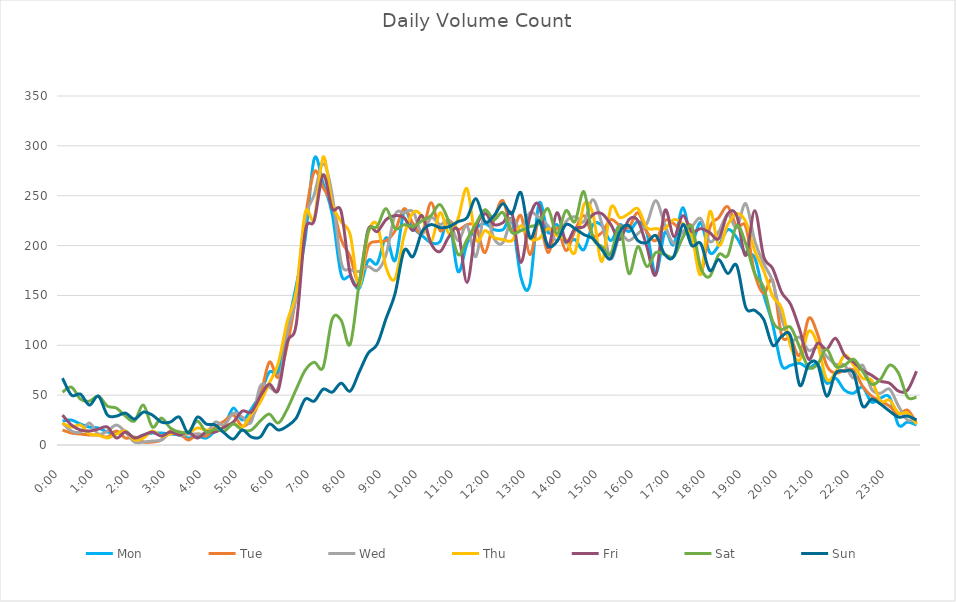
| Category | Mon | Tue | Wed | Thu | Fri | Sat | Sun |
|---|---|---|---|---|---|---|---|
| 0.0 | 24 | 15 | 22 | 22 | 30 | 53 | 67 |
| 0.010416666666666666 | 25 | 12 | 14 | 18 | 20 | 58 | 50 |
| 0.020833333333333332 | 21 | 11 | 13 | 20 | 15 | 46 | 51 |
| 0.03125 | 18 | 10 | 22 | 11 | 14 | 44 | 40 |
| 0.041666666666666664 | 17 | 10 | 11 | 10 | 16 | 49 | 49 |
| 0.05208333333333333 | 13 | 8 | 14 | 7 | 18 | 39 | 30 |
| 0.06249999999999999 | 12 | 14 | 20 | 11 | 7 | 37 | 29 |
| 0.07291666666666666 | 14 | 7 | 13 | 14 | 13 | 29 | 32 |
| 0.08333333333333333 | 7 | 8 | 3 | 5 | 7 | 24 | 26 |
| 0.09375 | 10 | 3 | 3 | 7 | 10 | 40 | 33 |
| 0.10416666666666667 | 12 | 3 | 4 | 14 | 13 | 18 | 30 |
| 0.11458333333333334 | 12 | 5 | 5 | 9 | 9 | 27 | 23 |
| 0.125 | 11 | 14 | 12 | 11 | 13 | 17 | 23 |
| 0.13541666666666666 | 10 | 12 | 10 | 13 | 10 | 13 | 28 |
| 0.14583333333333331 | 7 | 5 | 11 | 12 | 13 | 13 | 12 |
| 0.15624999999999997 | 9 | 11 | 11 | 17 | 7 | 24 | 28 |
| 0.16666666666666663 | 7 | 9 | 12 | 15 | 13 | 13 | 21 |
| 0.1770833333333333 | 14 | 18 | 23 | 15 | 13 | 16 | 20 |
| 0.18749999999999994 | 19 | 24 | 20 | 18 | 18 | 14 | 12 |
| 0.1979166666666666 | 37 | 30 | 32 | 22 | 23 | 21 | 6 |
| 0.20833333333333326 | 25 | 19 | 28 | 18 | 34 | 15 | 15 |
| 0.21874999999999992 | 36 | 26 | 23 | 31 | 33 | 15 | 8 |
| 0.22916666666666657 | 51 | 48 | 59 | 43 | 49 | 24 | 8 |
| 0.23958333333333323 | 73 | 83 | 58 | 62 | 61 | 31 | 21 |
| 0.2499999999999999 | 74 | 68 | 58 | 82 | 55 | 22 | 15 |
| 0.2604166666666666 | 117 | 100 | 113 | 124 | 103 | 36 | 19 |
| 0.27083333333333326 | 160 | 152 | 148 | 154 | 121 | 56 | 27 |
| 0.28124999999999994 | 207 | 227 | 226 | 233 | 214 | 75 | 46 |
| 0.29166666666666663 | 287 | 274 | 251 | 227 | 225 | 83 | 44 |
| 0.3020833333333333 | 262 | 258 | 282 | 289 | 271 | 78 | 56 |
| 0.3125 | 232 | 241 | 251 | 242 | 237 | 126 | 53 |
| 0.3229166666666667 | 171 | 206 | 183 | 224 | 234 | 125 | 62 |
| 0.33333333333333337 | 169 | 189 | 176 | 211 | 172 | 101 | 54 |
| 0.34375000000000006 | 157 | 163 | 174 | 159 | 163 | 162 | 73 |
| 0.35416666666666674 | 185 | 199 | 179 | 212 | 216 | 214 | 92 |
| 0.3645833333333334 | 182 | 204 | 175 | 221 | 214 | 219 | 101 |
| 0.3750000000000001 | 208 | 205 | 191 | 178 | 226 | 237 | 127 |
| 0.3854166666666668 | 185 | 215 | 231 | 167 | 230 | 217 | 152 |
| 0.3958333333333335 | 234 | 237 | 233 | 210 | 228 | 221 | 195 |
| 0.40625000000000017 | 218 | 222 | 234 | 233 | 215 | 219 | 189 |
| 0.41666666666666685 | 210 | 213 | 212 | 229 | 230 | 225 | 214 |
| 0.4270833333333333 | 203 | 243 | 228 | 204 | 202 | 230 | 221 |
| 0.4375000000000002 | 204 | 215 | 221 | 233 | 194 | 241 | 218 |
| 0.4479166666666669 | 225 | 225 | 225 | 212 | 209 | 223 | 219 |
| 0.4583333333333333 | 174 | 216 | 205 | 227 | 215 | 191 | 224 |
| 0.4687500000000003 | 202 | 221 | 220 | 257 | 163 | 206 | 228 |
| 0.47916666666666696 | 217 | 219 | 189 | 206 | 217 | 222 | 247 |
| 0.4895833333333333 | 222 | 193 | 235 | 215 | 232 | 236 | 224 |
| 0.5000000000000003 | 216 | 226 | 207 | 208 | 221 | 226 | 230 |
| 0.510416666666667 | 216 | 245 | 203 | 206 | 223 | 233 | 242 |
| 0.5208333333333334 | 225 | 214 | 227 | 205 | 232 | 213 | 232 |
| 0.5312500000000002 | 168 | 230 | 215 | 220 | 183 | 215 | 253 |
| 0.5416666666666669 | 161 | 191 | 233 | 207 | 229 | 219 | 208 |
| 0.5520833333333335 | 242 | 224 | 228 | 207 | 241 | 222 | 225 |
| 0.5625000000000001 | 213 | 193 | 220 | 217 | 198 | 237 | 200 |
| 0.5729166666666667 | 221 | 218 | 205 | 210 | 233 | 212 | 204 |
| 0.5833333333333334 | 203 | 195 | 224 | 206 | 204 | 235 | 221 |
| 0.59375 | 206 | 215 | 229 | 193 | 217 | 224 | 217 |
| 0.6041666666666666 | 196 | 230 | 224 | 241 | 219 | 254 | 211 |
| 0.6145833333333333 | 221 | 210 | 246 | 232 | 231 | 208 | 207 |
| 0.6249999999999999 | 220 | 213 | 222 | 184 | 232 | 199 | 196 |
| 0.6354166666666665 | 205 | 226 | 187 | 238 | 221 | 192 | 187 |
| 0.6458333333333331 | 221 | 220 | 210 | 228 | 206 | 219 | 214 |
| 0.6562499999999998 | 214 | 218 | 205 | 232 | 226 | 172 | 220 |
| 0.6666666666666666 | 224 | 233 | 212 | 237 | 225 | 199 | 205 |
| 0.677083333333333 | 213 | 214 | 222 | 218 | 199 | 179 | 203 |
| 0.6874999999999997 | 172 | 205 | 245 | 217 | 171 | 193 | 210 |
| 0.6979166666666666 | 213 | 225 | 221 | 217 | 235 | 191 | 191 |
| 0.7083333333333329 | 201 | 222 | 202 | 226 | 209 | 189 | 189 |
| 0.7187499999999996 | 238 | 214 | 214 | 222 | 230 | 208 | 221 |
| 0.7291666666666666 | 205 | 219 | 219 | 210 | 214 | 219 | 200 |
| 0.7395833333333328 | 223 | 173 | 227 | 171 | 217 | 178 | 202 |
| 0.75 | 193 | 218 | 204 | 234 | 213 | 169 | 175 |
| 0.7604166666666666 | 200 | 228 | 214 | 200 | 207 | 191 | 186 |
| 0.7708333333333327 | 216 | 239 | 231 | 221 | 232 | 190 | 172 |
| 0.78125 | 208 | 219 | 218 | 232 | 230 | 220 | 180 |
| 0.7916666666666666 | 192 | 219 | 242 | 224 | 190 | 202 | 138 |
| 0.8020833333333326 | 188 | 172 | 205 | 195 | 235 | 172 | 135 |
| 0.8125 | 151 | 152 | 182 | 175 | 189 | 158 | 126 |
| 0.8229166666666666 | 121 | 165 | 164 | 149 | 177 | 124 | 100 |
| 0.8333333333333334 | 80 | 110 | 127 | 137 | 153 | 116 | 109 |
| 0.84375 | 80 | 107 | 105 | 99 | 141 | 118 | 109 |
| 0.8541666666666666 | 82 | 90 | 108 | 85 | 116 | 98 | 60 |
| 0.8645833333333334 | 77 | 127 | 95 | 114 | 86 | 78 | 81 |
| 0.875 | 81 | 111 | 98 | 101 | 102 | 81 | 81 |
| 0.8854166666666666 | 62 | 80 | 89 | 66 | 96 | 96 | 49 |
| 0.8958333333333334 | 67 | 72 | 81 | 73 | 107 | 79 | 72 |
| 0.90625 | 55 | 75 | 80 | 90 | 90 | 80 | 74 |
| 0.9166666666666666 | 52 | 75 | 67 | 80 | 83 | 86 | 72 |
| 0.9270833333333334 | 58 | 59 | 80 | 67 | 75 | 74 | 39 |
| 0.9375 | 43 | 49 | 56 | 65 | 70 | 61 | 46 |
| 0.9479166666666666 | 47 | 44 | 52 | 44 | 64 | 66 | 41 |
| 0.9583333333333334 | 48 | 39 | 56 | 45 | 62 | 80 | 34 |
| 0.96875 | 20 | 31 | 39 | 32 | 54 | 72 | 28 |
| 0.9791666666666666 | 23 | 35 | 25 | 32 | 55 | 48 | 29 |
| 0.9895833333333334 | 20 | 22 | 26 | 21 | 74 | 48 | 25 |